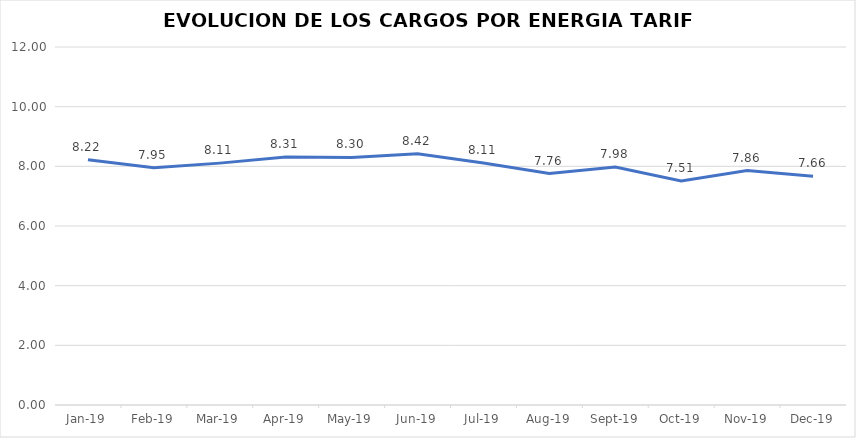
| Category | Series 0 |
|---|---|
| 2019-01-01 | 8.222 |
| 2019-02-01 | 7.952 |
| 2019-03-01 | 8.107 |
| 2019-04-01 | 8.31 |
| 2019-05-01 | 8.3 |
| 2019-06-01 | 8.42 |
| 2019-07-01 | 8.11 |
| 2019-08-01 | 7.758 |
| 2019-09-01 | 7.98 |
| 2019-10-01 | 7.51 |
| 2019-11-01 | 7.859 |
| 2019-12-01 | 7.665 |